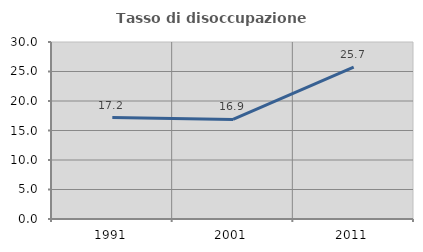
| Category | Tasso di disoccupazione giovanile  |
|---|---|
| 1991.0 | 17.201 |
| 2001.0 | 16.883 |
| 2011.0 | 25.749 |